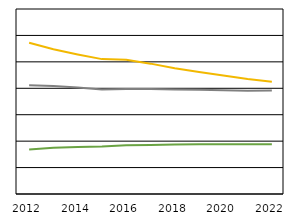
| Category | III. | II. | I. |
|---|---|---|---|
| 2012.0 | 114453 | 33734 | 82238 |
| 2013.0 | 109532 | 35090 | 81688 |
| 2014.0 | 105622 | 35593 | 80542 |
| 2015.0 | 102070 | 35856 | 79052 |
| 2016.0 | 101588 | 36888 | 79482 |
| 2017.0 | 98651 | 37159 | 79378 |
| 2018.0 | 95121 | 37497 | 79066 |
| 2019.0 | 92260 | 37682 | 78889 |
| 2020.0 | 89630 | 37705 | 78532 |
| 2021.0 | 86976 | 37630 | 78117 |
| 2022.0 | 84968 | 37666 | 78346 |